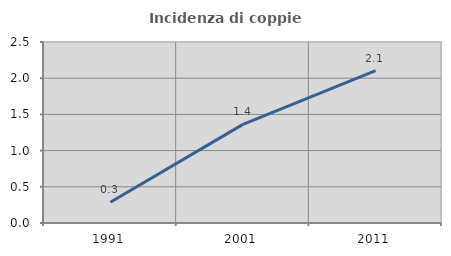
| Category | Incidenza di coppie miste |
|---|---|
| 1991.0 | 0.286 |
| 2001.0 | 1.362 |
| 2011.0 | 2.105 |